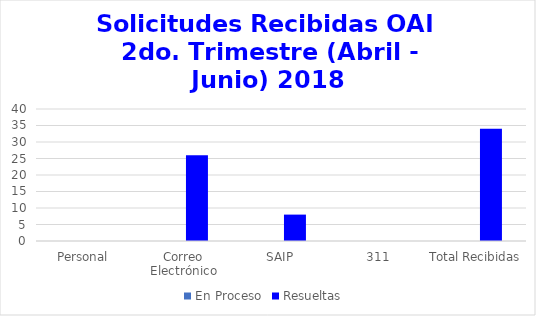
| Category | En Proceso | Resueltas  |
|---|---|---|
| Personal | 0 | 0 |
| Correo Electrónico | 0 | 26 |
| SAIP | 0 | 8 |
| 311 | 0 | 0 |
| Total Recibidas | 0 | 34 |